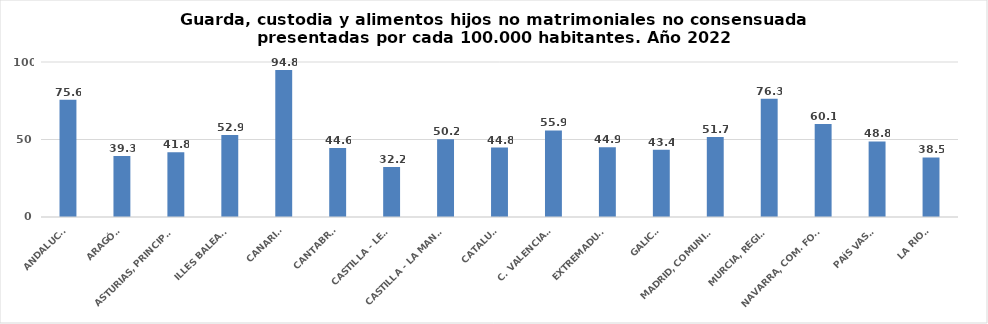
| Category | Series 0 |
|---|---|
| ANDALUCÍA | 75.607 |
| ARAGÓN | 39.282 |
| ASTURIAS, PRINCIPADO | 41.804 |
| ILLES BALEARS | 52.947 |
| CANARIAS | 94.779 |
| CANTABRIA | 44.585 |
| CASTILLA - LEÓN | 32.243 |
| CASTILLA - LA MANCHA | 50.211 |
| CATALUÑA | 44.825 |
| C. VALENCIANA | 55.865 |
| EXTREMADURA | 44.938 |
| GALICIA | 43.375 |
| MADRID, COMUNIDAD | 51.657 |
| MURCIA, REGIÓN | 76.312 |
| NAVARRA, COM. FORAL | 60.08 |
| PAÍS VASCO | 48.773 |
| LA RIOJA | 38.45 |